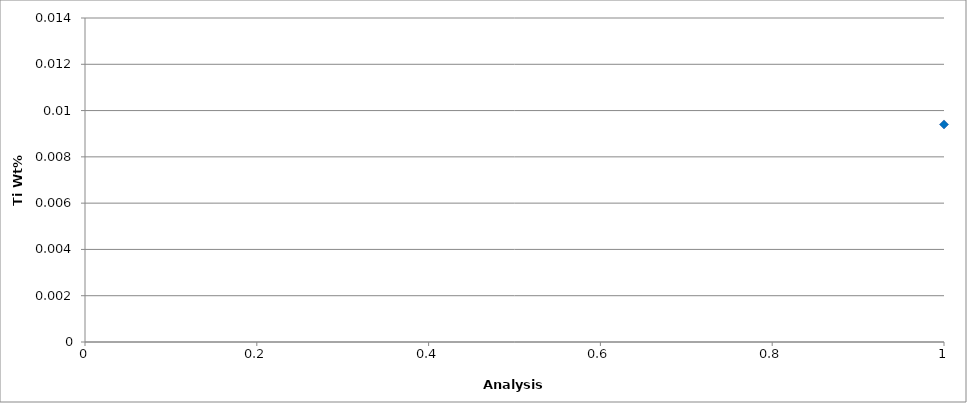
| Category | Series 0 |
|---|---|
| 0 | 0.009 |
| 1 | 0.008 |
| 2 | 0.009 |
| 3 | 0.009 |
| 4 | 0.011 |
| 5 | 0.009 |
| 6 | 0.009 |
| 7 | 0.009 |
| 8 | 0.009 |
| 9 | 0.009 |
| 10 | 0.008 |
| 11 | 0.01 |
| 12 | 0.011 |
| 13 | 0.009 |
| 14 | 0.008 |
| 15 | 0.008 |
| 16 | 0.008 |
| 17 | 0.009 |
| 18 | 0.01 |
| 19 | 0.009 |
| 20 | 0.006 |
| 21 | 0.009 |
| 22 | 0.009 |
| 23 | 0.008 |
| 24 | 0.009 |
| 25 | 0.009 |
| 26 | 0.006 |
| 27 | 0.009 |
| 28 | 0.008 |
| 29 | 0.008 |
| 30 | 0.011 |
| 31 | 0.009 |
| 32 | 0.009 |
| 33 | 0.009 |
| 34 | 0.01 |
| 35 | 0.009 |
| 36 | 0.008 |
| 37 | 0.008 |
| 38 | 0.008 |
| 39 | 0.01 |
| 40 | 0.009 |
| 41 | 0.009 |
| 42 | 0.007 |
| 43 | 0.009 |
| 44 | 0.01 |
| 45 | 0.008 |
| 46 | 0.009 |
| 47 | 0.009 |
| 48 | 0.009 |
| 49 | 0.01 |
| 50 | 0.012 |
| 51 | 0.008 |
| 52 | 0.009 |
| 53 | 0.01 |
| 54 | 0.006 |
| 55 | 0.008 |
| 56 | 0.011 |
| 57 | 0.009 |
| 58 | 0.008 |
| 59 | 0.008 |
| 60 | 0.009 |
| 61 | 0.01 |
| 62 | 0.009 |
| 63 | 0.009 |
| 64 | 0.007 |
| 65 | 0.008 |
| 66 | 0.008 |
| 67 | 0.009 |
| 68 | 0.009 |
| 69 | 0.009 |
| 70 | 0.009 |
| 71 | 0.008 |
| 72 | 0.009 |
| 73 | 0.01 |
| 74 | 0.008 |
| 75 | 0.009 |
| 76 | 0.008 |
| 77 | 0.009 |
| 78 | 0.009 |
| 79 | 0.009 |
| 80 | 0.009 |
| 81 | 0.008 |
| 82 | 0.009 |
| 83 | 0.009 |
| 84 | 0.009 |
| 85 | 0.01 |
| 86 | 0.009 |